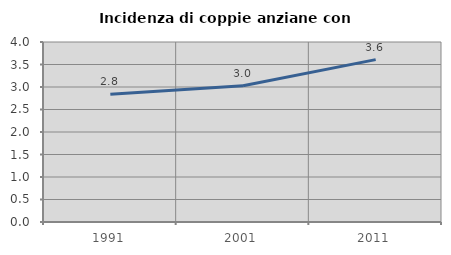
| Category | Incidenza di coppie anziane con figli |
|---|---|
| 1991.0 | 2.838 |
| 2001.0 | 3.027 |
| 2011.0 | 3.609 |